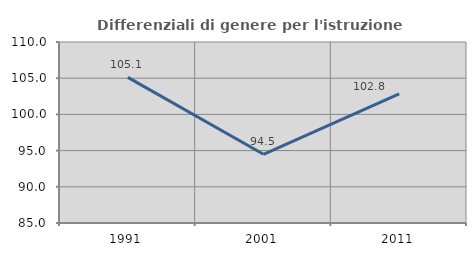
| Category | Differenziali di genere per l'istruzione superiore |
|---|---|
| 1991.0 | 105.121 |
| 2001.0 | 94.489 |
| 2011.0 | 102.832 |